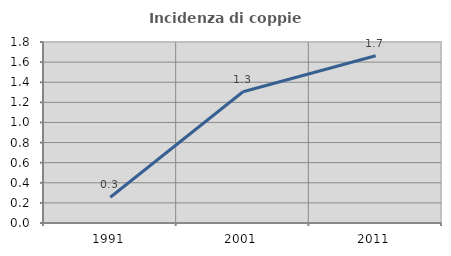
| Category | Incidenza di coppie miste |
|---|---|
| 1991.0 | 0.256 |
| 2001.0 | 1.305 |
| 2011.0 | 1.664 |